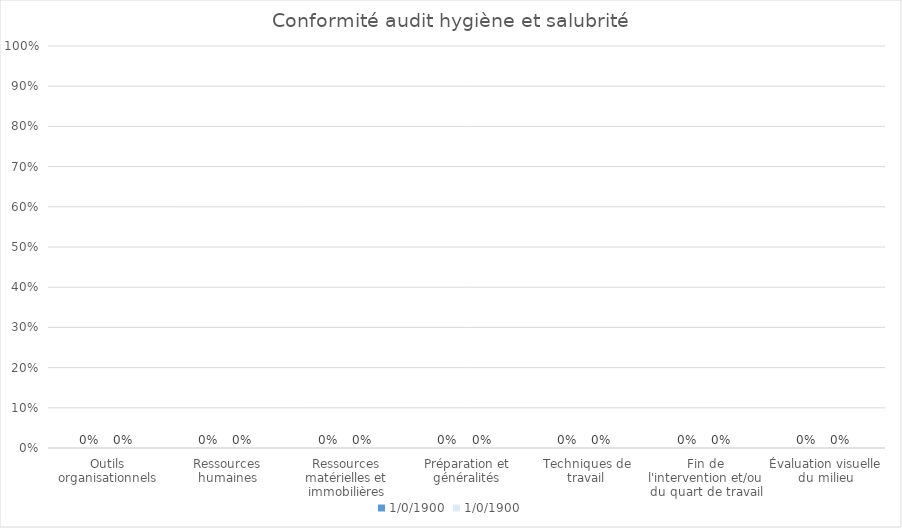
| Category | 1900-01-00 |
|---|---|
| Outils organisationnels | 0 |
| Ressources humaines | 0 |
| Ressources matérielles et immobilières | 0 |
| Préparation et généralités | 0 |
| Techniques de travail | 0 |
| Fin de l'intervention et/ou du quart de travail | 0 |
| Évaluation visuelle du milieu | 0 |